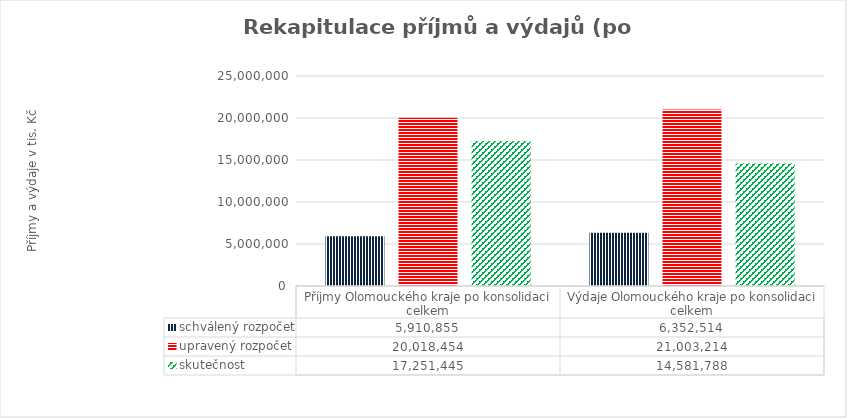
| Category | schválený rozpočet | upravený rozpočet | skutečnost |
|---|---|---|---|
| Příjmy Olomouckého kraje po konsolidaci celkem | 5910855 | 20018454 | 17251445 |
| Výdaje Olomouckého kraje po konsolidaci celkem | 6352514 | 21003214 | 14581788 |